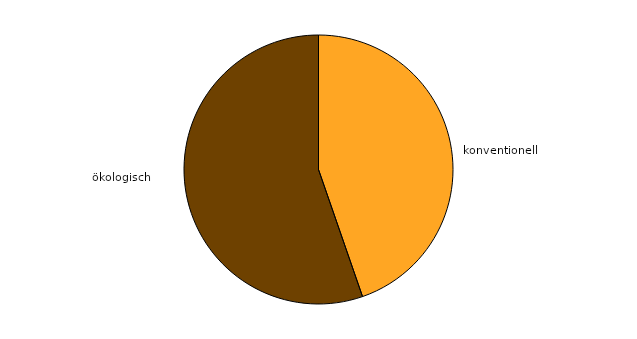
| Category | Series 0 |
|---|---|
| konventionell | 487.57 |
| ökologisch | 603.46 |